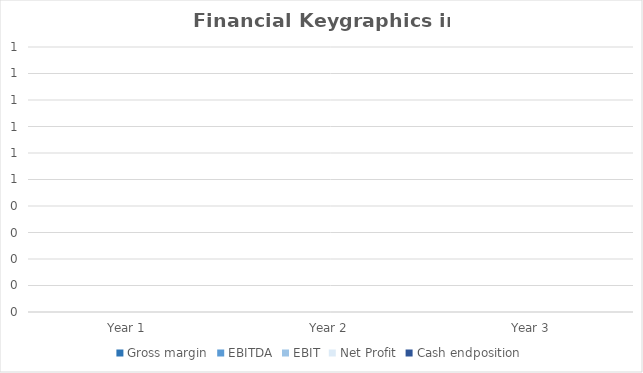
| Category | Gross margin | EBITDA | EBIT | Net Profit | Cash endposition |
|---|---|---|---|---|---|
| Year 1 | 0 | 0 | 0 | 0 | 0 |
| Year 2 | 0 | 0 | 0 | 0 | 0 |
| Year 3 | 0 | 0 | 0 | 0 | 0 |